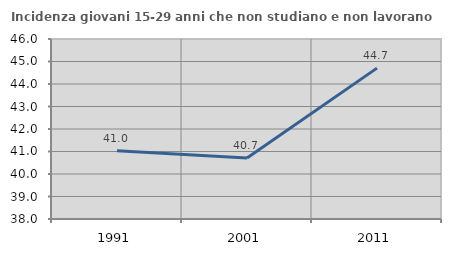
| Category | Incidenza giovani 15-29 anni che non studiano e non lavorano  |
|---|---|
| 1991.0 | 41.029 |
| 2001.0 | 40.708 |
| 2011.0 | 44.706 |